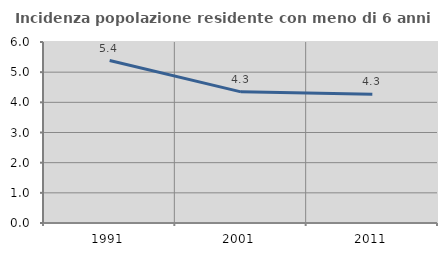
| Category | Incidenza popolazione residente con meno di 6 anni |
|---|---|
| 1991.0 | 5.386 |
| 2001.0 | 4.348 |
| 2011.0 | 4.264 |